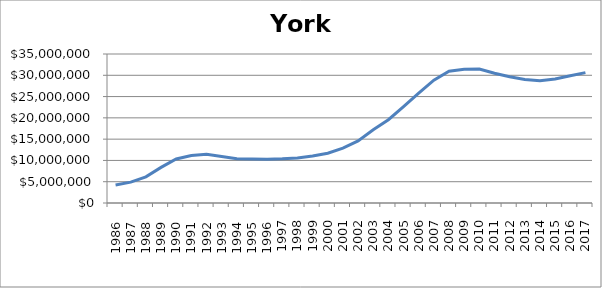
| Category | York (000s) |
|---|---|
|       1986 | 4238800 |
|       1987 | 4897400 |
|       1988 | 6136250 |
|       1989 | 8362450 |
|       1990 | 10341650 |
|       1991 | 11148950 |
|       1992 | 11465100 |
|       1993 | 10933050 |
|       1994 | 10386900 |
|       1995 | 10318450 |
|       1996 | 10277600 |
| 1997 | 10373800 |
| 1998 | 10575750 |
| 1999 | 11017500 |
| 2000 | 11701550 |
| 2001 | 12871900 |
| 2002 | 14590700 |
| 2003 | 17199850 |
| 2004 | 19555900 |
| 2005 | 22623450 |
| 2006 | 25789750 |
| 2007 | 28845750 |
| 2008 | 30950350 |
| 2009 | 31407300 |
| 2010 | 31457900 |
| 2011 | 30462150 |
| 2012 | 29637800 |
| 2013 | 29012250 |
| 2014 | 28703250 |
| 2015 | 29117100 |
| 2016 | 29878050 |
| 2017 | 30629550 |